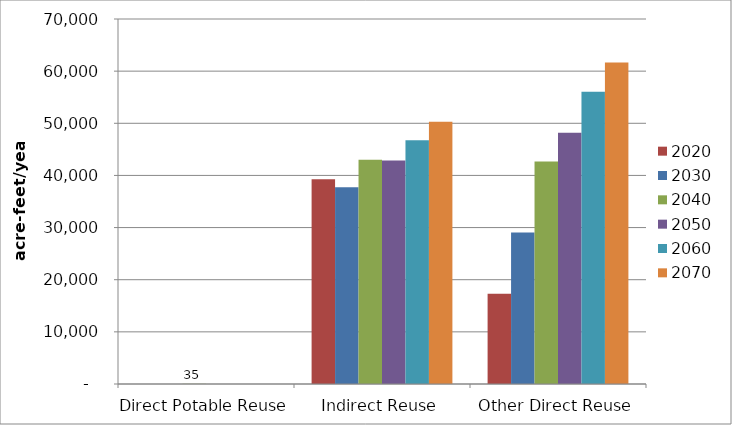
| Category | 2020 | 2030 | 2040 | 2050 | 2060 | 2070 |
|---|---|---|---|---|---|---|
| Direct Potable Reuse | 0 | 0 | 35 | 0 | 0 | 0 |
| Indirect Reuse | 39258 | 37749 | 42990 | 42874 | 46759 | 50312 |
| Other Direct Reuse | 17325 | 29057 | 42667 | 48189 | 56054 | 61636 |